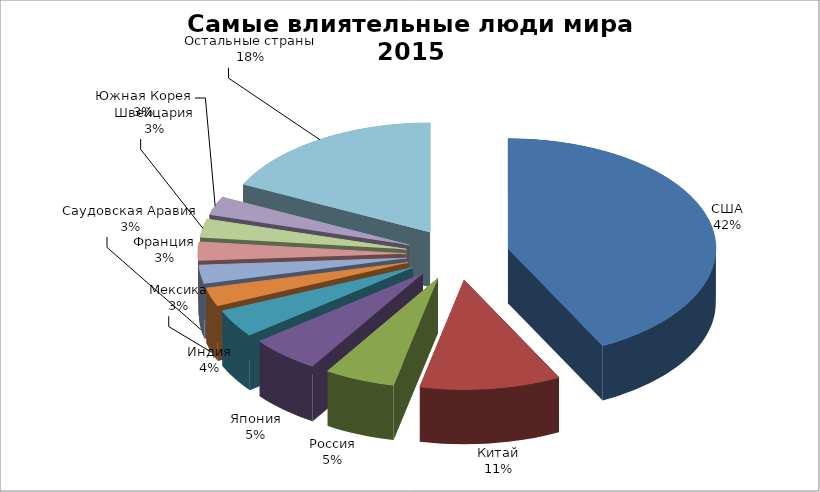
| Category | Series 0 |
|---|---|
| США | 31 |
| Китай | 8 |
| Россия | 4 |
| Япония | 4 |
| Индия | 3 |
| Мексика | 2 |
| Саудовская Аравия | 2 |
| Франция | 2 |
| Швейцария | 2 |
| Южная Корея | 2 |
| Остальные страны | 13 |